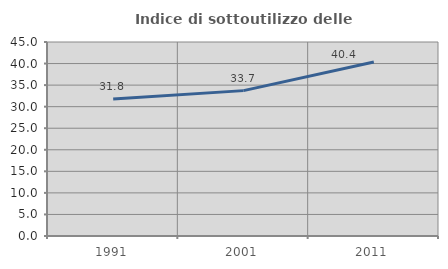
| Category | Indice di sottoutilizzo delle abitazioni  |
|---|---|
| 1991.0 | 31.795 |
| 2001.0 | 33.721 |
| 2011.0 | 40.363 |